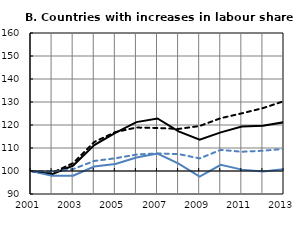
| Category | Labour productivity (Leaders) | Labour productivity (Others) | Real wages (Leaders) | Real wages (Others) |
|---|---|---|---|---|
| 2001.0 | 100 | 100 | 100 | 100 |
| 2002.0 | 98.645 | 97.963 | 99.147 | 99.712 |
| 2003.0 | 102.377 | 97.941 | 103.451 | 100.839 |
| 2004.0 | 111.285 | 101.924 | 112.63 | 104.368 |
| 2005.0 | 116.556 | 103.069 | 116.913 | 105.537 |
| 2006.0 | 121.246 | 105.881 | 118.892 | 107.132 |
| 2007.0 | 122.826 | 107.558 | 118.691 | 107.663 |
| 2008.0 | 117.229 | 103.241 | 118.299 | 107.356 |
| 2009.0 | 113.597 | 97.519 | 119.569 | 105.479 |
| 2010.0 | 116.801 | 102.663 | 122.964 | 109.185 |
| 2011.0 | 119.365 | 100.595 | 125.076 | 108.372 |
| 2012.0 | 119.647 | 99.789 | 127.333 | 108.816 |
| 2013.0 | 121.21 | 100.796 | 130.374 | 109.613 |